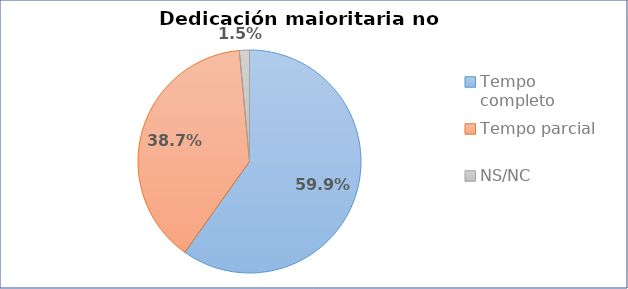
| Category | Dedicación maioritaria |
|---|---|
| Tempo completo | 0.599 |
| Tempo parcial | 0.387 |
| NS/NC | 0.015 |